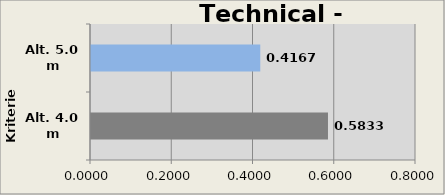
| Category | Complexity |
|---|---|
| Alt. 4.0 m | 0.583 |
| Alt. 5.0 m | 0.417 |